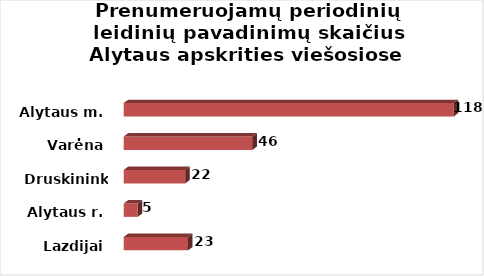
| Category | Alytaus m. |
|---|---|
| Lazdijai | 23 |
| Alytaus r. | 5 |
| Druskininkai | 22 |
| Varėna | 46 |
| Alytaus m. | 118 |